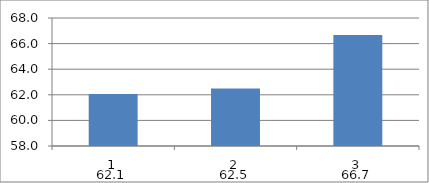
| Category | Series 0 |
|---|---|
| 0 | 62.069 |
| 1 | 62.5 |
| 2 | 66.667 |